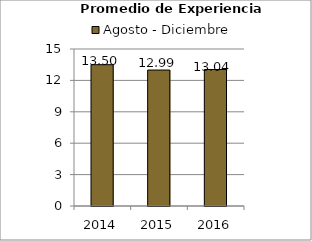
| Category | Agosto - Diciembre |
|---|---|
| 2014.0 | 13.5 |
| 2015.0 | 12.99 |
| 2016.0 | 13.04 |